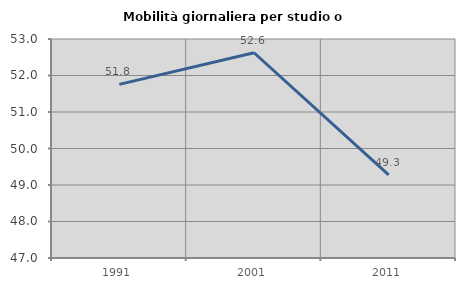
| Category | Mobilità giornaliera per studio o lavoro |
|---|---|
| 1991.0 | 51.757 |
| 2001.0 | 52.623 |
| 2011.0 | 49.279 |